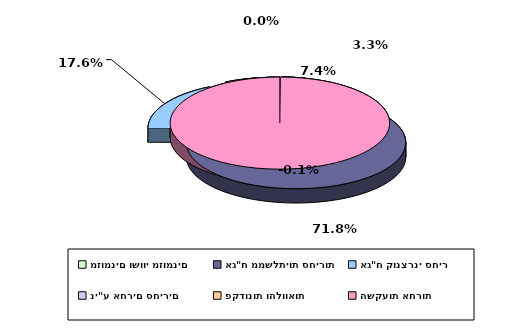
| Category | Series 0 |
|---|---|
| מזומנים ושווי מזומנים | 0.033 |
| אג"ח ממשלתיות סחירות | 0.718 |
| אג"ח קונצרני סחיר | 0.176 |
| ני"ע אחרים סחירים | 0.074 |
| פקדונות והלוואות | 0 |
| השקעות אחרות | -0.001 |